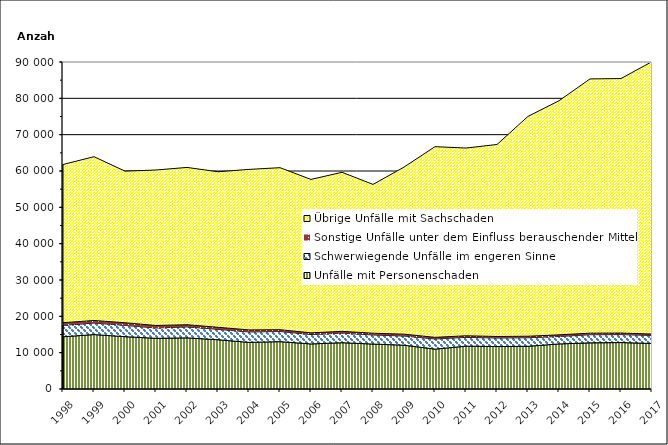
| Category | Unfälle mit Personenschaden | Schwerwiegende Unfälle im engeren Sinne | Sonstige Unfälle unter dem Einfluss berauschender Mittel 1) | Übrige Unfälle mit Sachschaden |
|---|---|---|---|---|
| 1998.0 | 14376 | 3136 | 737 | 43539 |
| 1999.0 | 14979 | 3185 | 696 | 45079 |
| 2000.0 | 14406 | 3105 | 725 | 41724 |
| 2001.0 | 13950 | 2845 | 688 | 42788 |
| 2002.0 | 14072 | 3028 | 595 | 43289 |
| 2003.0 | 13561 | 2866 | 559 | 42806 |
| 2004.0 | 12827 | 2877 | 564 | 44173 |
| 2005.0 | 13033 | 2795 | 499 | 44581 |
| 2006.0 | 12400 | 2588 | 466 | 42228 |
| 2007.0 | 12740 | 2628 | 507 | 43770 |
| 2008.0 | 12369 | 2510 | 481 | 40954 |
| 2009.0 | 12061 | 2528 | 502 | 45976 |
| 2010.0 | 10974 | 2803 | 441 | 52481 |
| 2011.0 | 11793 | 2419 | 443 | 51662 |
| 2012.0 | 11682 | 2353 | 422 | 52839 |
| 2013.0 | 11757 | 2357 | 414 | 60506 |
| 2014.0 | 12404 | 2056 | 448 | 64425 |
| 2015.0 | 12695 | 2249 | 427 | 69975 |
| 2016.0 | 12783 | 2187 | 433 | 70040 |
| 2017.0 | 12528 | 2214 | 385 | 74978 |